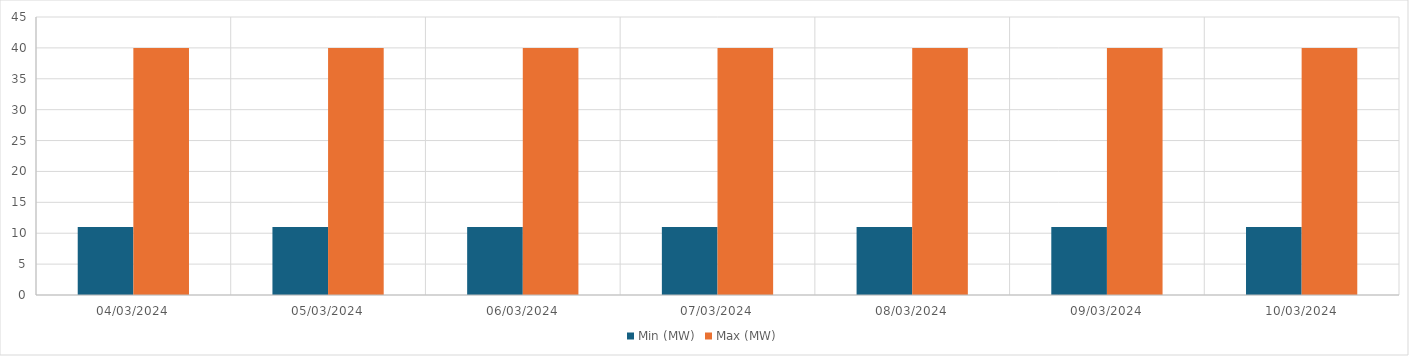
| Category | Min (MW) | Max (MW) |
|---|---|---|
| 04/03/2024 | 11 | 40 |
| 05/03/2024 | 11 | 40 |
| 06/03/2024 | 11 | 40 |
| 07/03/2024 | 11 | 40 |
| 08/03/2024 | 11 | 40 |
| 09/03/2024 | 11 | 40 |
| 10/03/2024 | 11 | 40 |